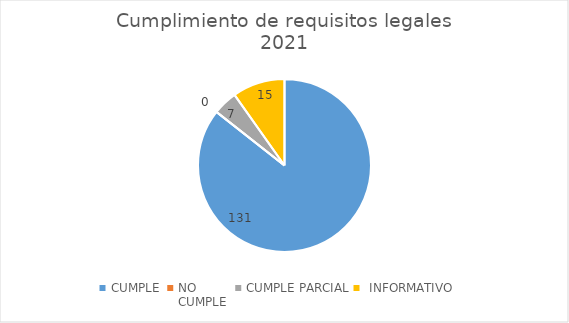
| Category | Series 0 |
|---|---|
| CUMPLE  | 131 |
| NO 
CUMPLE  | 0 |
| CUMPLE PARCIAL | 7 |
|  INFORMATIVO  | 15 |